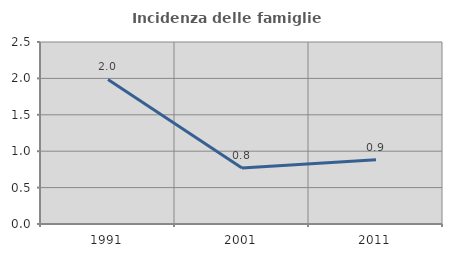
| Category | Incidenza delle famiglie numerose |
|---|---|
| 1991.0 | 1.987 |
| 2001.0 | 0.768 |
| 2011.0 | 0.881 |